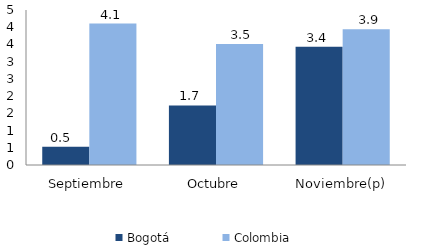
| Category | Bogotá | Colombia |
|---|---|---|
| Septiembre | 0.527 | 4.108 |
| Octubre | 1.73 | 3.516 |
| Noviembre(p) | 3.43 | 3.942 |